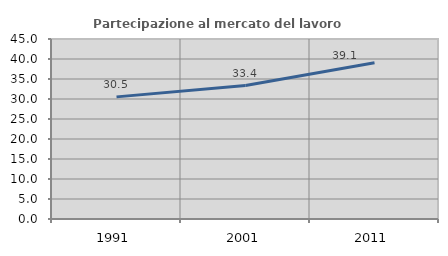
| Category | Partecipazione al mercato del lavoro  femminile |
|---|---|
| 1991.0 | 30.53 |
| 2001.0 | 33.352 |
| 2011.0 | 39.052 |